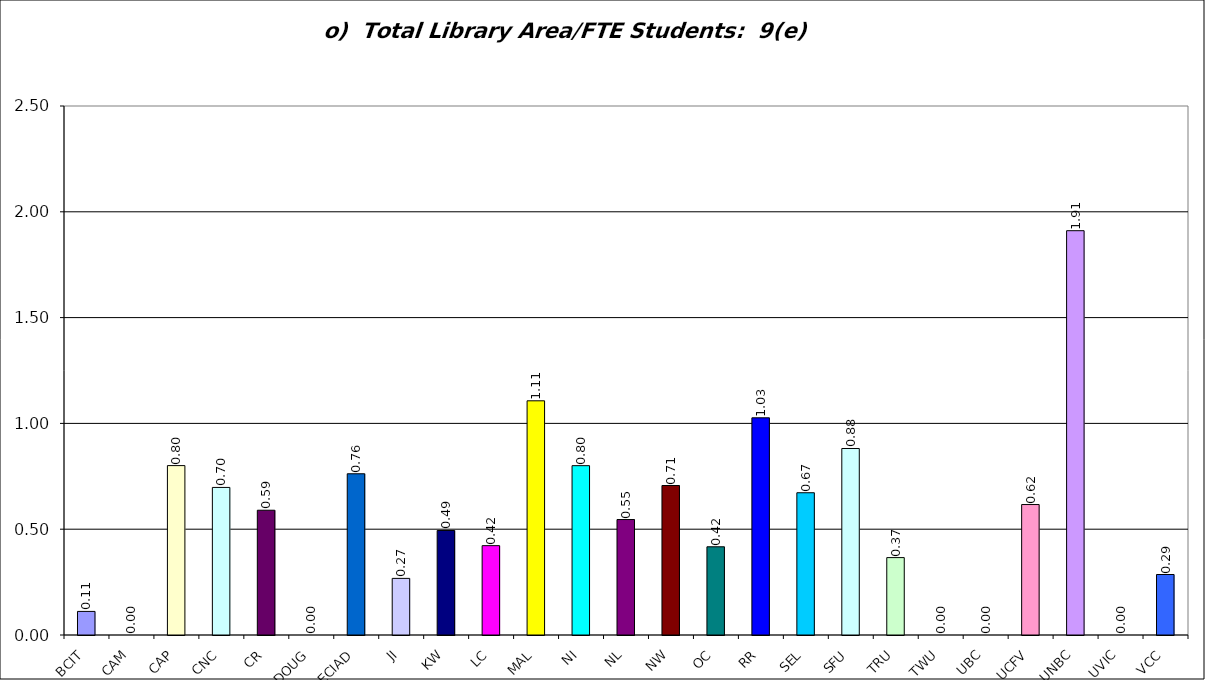
| Category | o)  Total Library Area/FTE Students:  9(e) total /3(a) |
|---|---|
| BCIT | 0.111 |
| CAM | 0 |
| CAP | 0.801 |
| CNC | 0.697 |
| CR | 0.59 |
| DOUG | 0 |
| ECIAD | 0.762 |
| JI | 0.268 |
| KW | 0.494 |
| LC | 0.422 |
| MAL | 1.107 |
| NI | 0.8 |
| NL | 0.546 |
| NW | 0.707 |
| OC | 0.417 |
| RR | 1.026 |
| SEL | 0.672 |
| SFU | 0.881 |
| TRU | 0.366 |
| TWU | 0 |
| UBC | 0 |
| UCFV | 0.617 |
| UNBC | 1.911 |
| UVIC | 0 |
| VCC | 0.286 |